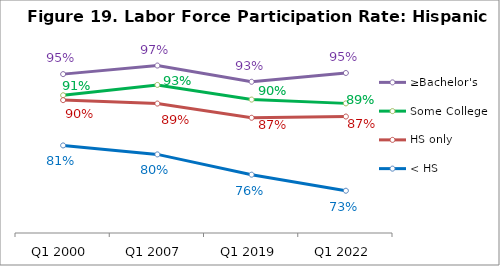
| Category | ≥Bachelor's | Some College | HS only | < HS |
|---|---|---|---|---|
| Q1 2000 | 0.949 | 0.909 | 0.9 | 0.815 |
| Q1 2007 | 0.965 | 0.929 | 0.894 | 0.798 |
| Q1 2019 | 0.935 | 0.901 | 0.867 | 0.76 |
| Q1 2022 | 0.951 | 0.894 | 0.869 | 0.73 |